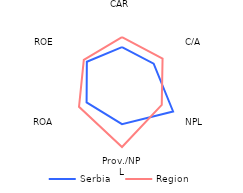
| Category | Serbia | Region |
|---|---|---|
| CAR | 2.388 | 3.071 |
| C/A | 2.504 | 3.208 |
| NPL | 4.04 | 3.144 |
| Prov./NPL | 2.888 | 4.456 |
| ROA | 2.8 | 3.4 |
| ROE | 2.78 | 3.02 |